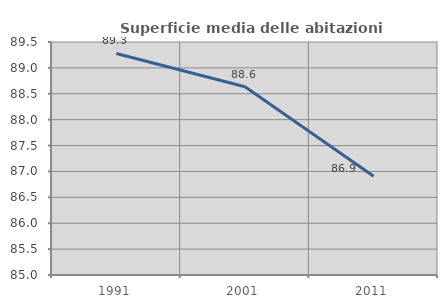
| Category | Superficie media delle abitazioni occupate |
|---|---|
| 1991.0 | 89.279 |
| 2001.0 | 88.635 |
| 2011.0 | 86.907 |